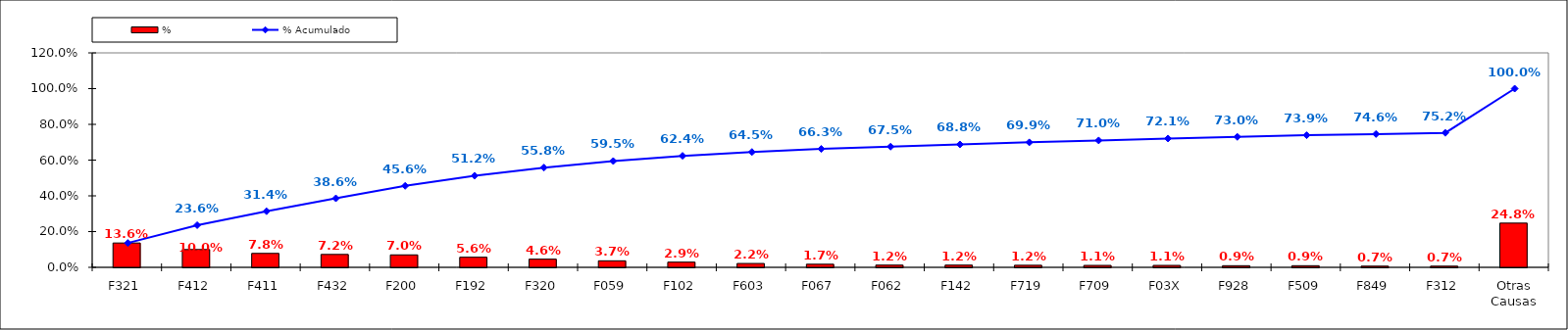
| Category | % |
|---|---|
| F321 | 0.136 |
| F412 | 0.1 |
| F411 | 0.078 |
| F432 | 0.072 |
| F200 | 0.07 |
| F192 | 0.056 |
| F320 | 0.046 |
| F059 | 0.037 |
| F102 | 0.029 |
| F603 | 0.022 |
| F067 | 0.017 |
| F062 | 0.012 |
| F142 | 0.012 |
| F719 | 0.012 |
| F709 | 0.011 |
| F03X | 0.011 |
| F928 | 0.009 |
| F509 | 0.009 |
| F849 | 0.007 |
| F312 | 0.007 |
| Otras Causas | 0.248 |